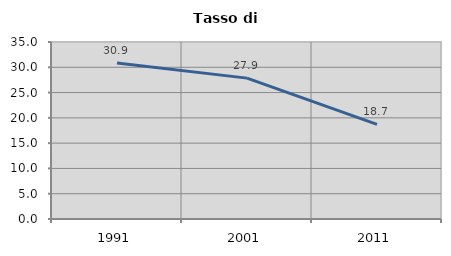
| Category | Tasso di disoccupazione   |
|---|---|
| 1991.0 | 30.85 |
| 2001.0 | 27.858 |
| 2011.0 | 18.702 |